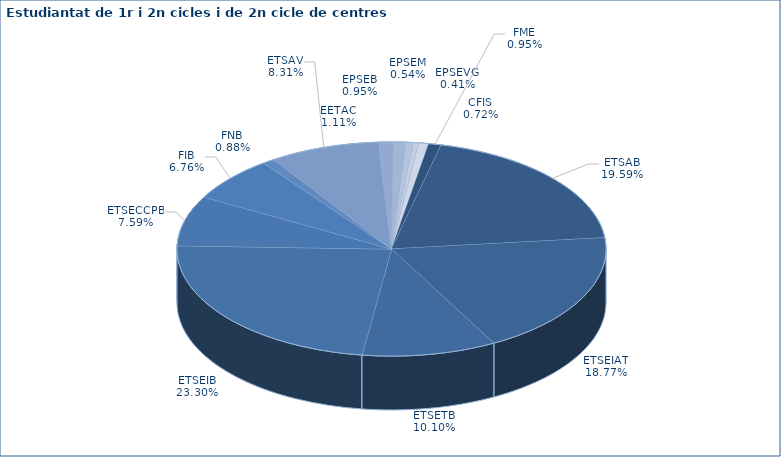
| Category | Series 0 |
|---|---|
| FME | 114 |
| ETSAB | 2352 |
| ETSEIAT | 2253 |
| ETSETB | 1213 |
| ETSEIB | 2797 |
| ETSECCPB | 911 |
| FIB | 812 |
| FNB | 106 |
| ETSAV | 998 |
| EETAC | 133 |
| EPSEB | 114 |
| EPSEM | 65 |
| EPSEVG | 49 |
| CFIS | 87 |